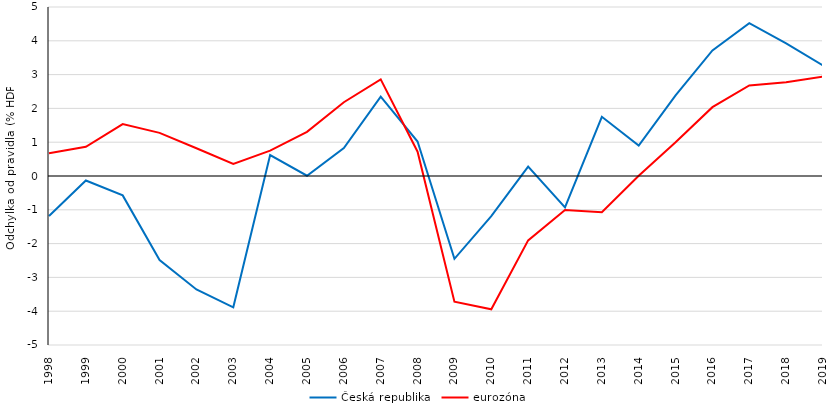
| Category | Česká republika | eurozóna |
|---|---|---|
| 1998.0 | -1.182 | 0.673 |
| 1999.0 | -0.132 | 0.863 |
| 2000.0 | -0.575 | 1.536 |
| 2001.0 | -2.485 | 1.277 |
| 2002.0 | -3.356 | 0.822 |
| 2003.0 | -3.885 | 0.356 |
| 2004.0 | 0.619 | 0.751 |
| 2005.0 | 0.009 | 1.308 |
| 2006.0 | 0.828 | 2.183 |
| 2007.0 | 2.346 | 2.858 |
| 2008.0 | 1.02 | 0.719 |
| 2009.0 | -2.45 | -3.719 |
| 2010.0 | -1.19 | -3.944 |
| 2011.0 | 0.276 | -1.904 |
| 2012.0 | -0.93 | -1.008 |
| 2013.0 | 1.752 | -1.074 |
| 2014.0 | 0.901 | 0.005 |
| 2015.0 | 2.385 | 0.997 |
| 2016.0 | 3.716 | 2.036 |
| 2017.0 | 4.52 | 2.68 |
| 2018.0 | 3.925 | 2.771 |
| 2019.0 | 3.272 | 2.941 |